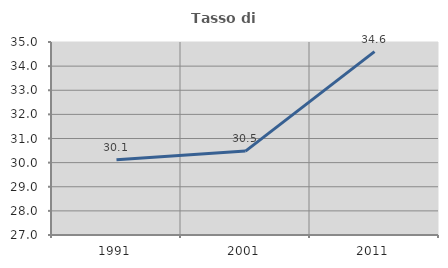
| Category | Tasso di occupazione   |
|---|---|
| 1991.0 | 30.118 |
| 2001.0 | 30.479 |
| 2011.0 | 34.602 |